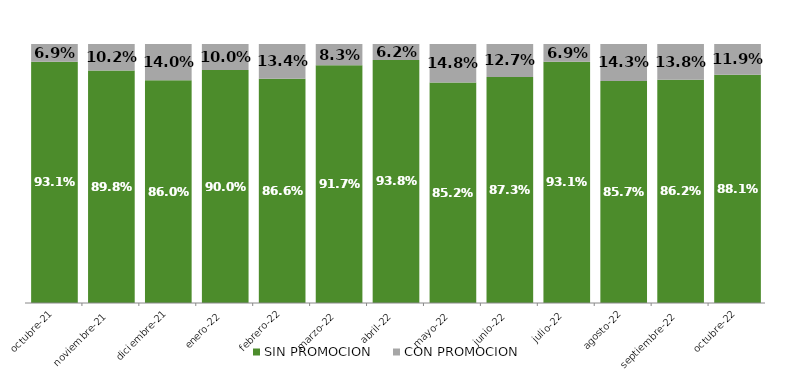
| Category | SIN PROMOCION   | CON PROMOCION   |
|---|---|---|
| 2021-10-01 | 0.931 | 0.069 |
| 2021-11-01 | 0.898 | 0.102 |
| 2021-12-01 | 0.86 | 0.14 |
| 2022-01-01 | 0.9 | 0.1 |
| 2022-02-01 | 0.866 | 0.134 |
| 2022-03-01 | 0.917 | 0.083 |
| 2022-04-01 | 0.938 | 0.062 |
| 2022-05-01 | 0.852 | 0.148 |
| 2022-06-01 | 0.873 | 0.127 |
| 2022-07-01 | 0.931 | 0.069 |
| 2022-08-01 | 0.857 | 0.143 |
| 2022-09-01 | 0.862 | 0.138 |
| 2022-10-01 | 0.881 | 0.119 |